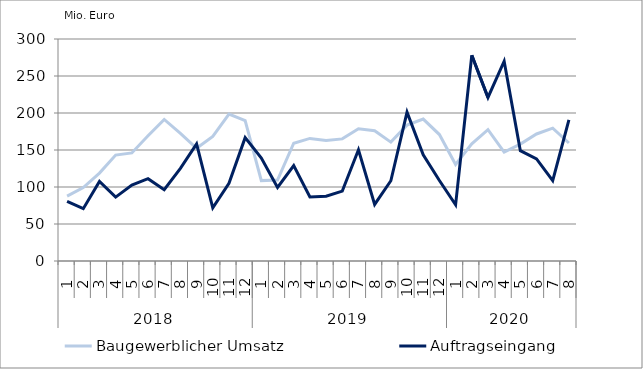
| Category | Baugewerblicher Umsatz | Auftragseingang |
|---|---|---|
| 0 | 87640.529 | 80684.627 |
| 1 | 99259.455 | 70746.763 |
| 2 | 118764.324 | 107538.747 |
| 3 | 143144.178 | 86374.619 |
| 4 | 146070.782 | 102661.329 |
| 5 | 169150.753 | 111287.709 |
| 6 | 191277.885 | 96286.662 |
| 7 | 172425.535 | 125142.495 |
| 8 | 152354.98 | 158112.302 |
| 9 | 168372.756 | 71808.619 |
| 10 | 198558.472 | 104904.147 |
| 11 | 189665.914 | 166653.461 |
| 12 | 108616.605 | 139065.287 |
| 13 | 109331.58 | 99318.609 |
| 14 | 159117.81 | 129002.041 |
| 15 | 165654.287 | 86579.2 |
| 16 | 162976.056 | 87644.362 |
| 17 | 165026.188 | 94463.186 |
| 18 | 178622.938 | 150345.08 |
| 19 | 176074.101 | 76434.317 |
| 20 | 160663.041 | 108444.162 |
| 21 | 183589.485 | 201122.697 |
| 22 | 191777.213 | 143514.792 |
| 23 | 170885.223 | 108780.022 |
| 24 | 130445.562 | 75891.481 |
| 25 | 158433.655 | 277923.85 |
| 26 | 177529.832 | 220973.626 |
| 27 | 147259.799 | 269936.091 |
| 28 | 157965.891 | 149072.895 |
| 29 | 171647.778 | 137984.76 |
| 30 | 179530.732 | 108645.965 |
| 31 | 159480.457 | 190771.468 |